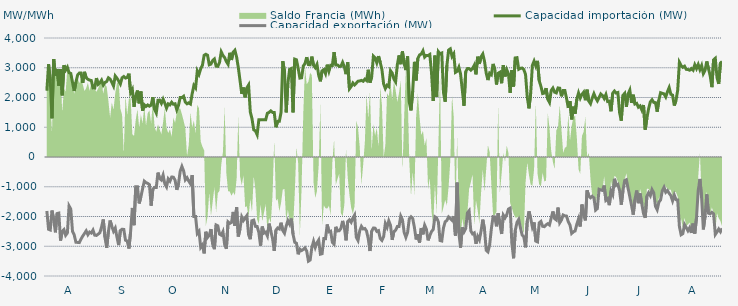
| Category | Capacidad importación (MW) | Capacidad exportación (MW) |
|---|---|---|
| 0 | 2229.167 | -1813.75 |
| 1900-01-01 | 3118.458 | -2430.875 |
| 1900-01-02 | 2560.5 | -2453.333 |
| 1900-01-03 | 1300 | -1800 |
| 1900-01-04 | 3293.208 | -2107.333 |
| 1900-01-05 | 2732.333 | -2531.667 |
| 1900-01-06 | 2958.208 | -1899.667 |
| 1900-01-07 | 2400 | -1885.417 |
| 1900-01-08 | 2949.792 | -2809.042 |
| 1900-01-09 | 2072.292 | -2500 |
| 1900-01-10 | 3083.958 | -2440.167 |
| 1900-01-11 | 2921.208 | -2632.667 |
| 1900-01-12 | 3017.667 | -2556.542 |
| 1900-01-13 | 2833.833 | -1646.083 |
| 1900-01-14 | 2807.833 | -1750 |
| 1900-01-15 | 2510.417 | -2496.792 |
| 1900-01-16 | 2220.833 | -2618.625 |
| 1900-01-17 | 2512.5 | -2867.042 |
| 1900-01-18 | 2756.375 | -2870.75 |
| 1900-01-19 | 2821.542 | -2876.667 |
| 1900-01-20 | 2821.833 | -2755.625 |
| 1900-01-21 | 2490.292 | -2656.833 |
| 1900-01-22 | 2862.667 | -2571.458 |
| 1900-01-23 | 2663.042 | -2482.25 |
| 1900-01-24 | 2613.625 | -2612.792 |
| 1900-01-25 | 2585.667 | -2523.458 |
| 1900-01-26 | 2571.292 | -2556.167 |
| 1900-01-27 | 2320.458 | -2456.542 |
| 1900-01-28 | 2316.542 | -2627.667 |
| 1900-01-29 | 2652.5 | -2635.708 |
| 1900-01-30 | 2442.625 | -2594.208 |
| 1900-01-31 | 2493.458 | -2546.125 |
| 1900-02-01 | 2582.917 | -2351.208 |
| 1900-02-02 | 2416.667 | -2100 |
| 1900-02-03 | 2504.5 | -2703.167 |
| 1900-02-04 | 2536.625 | -3052.25 |
| 1900-02-05 | 2662.208 | -2510.833 |
| 1900-02-06 | 2620.667 | -2134.75 |
| 1900-02-07 | 2511.833 | -2330.583 |
| 1900-02-08 | 2387.333 | -2494.25 |
| 1900-02-09 | 2724.583 | -2389 |
| 1900-02-10 | 2648.667 | -2691.542 |
| 1900-02-11 | 2557.292 | -2961.542 |
| 1900-02-12 | 2454.083 | -2472.25 |
| 1900-02-13 | 2661.417 | -2427.292 |
| 1900-02-14 | 2704.833 | -2434.167 |
| 1900-02-15 | 2653.75 | -2795.833 |
| 1900-02-16 | 2673.75 | -2822.875 |
| 1900-02-17 | 2800.917 | -3075.208 |
| 1900-02-18 | 2164.417 | -2510.625 |
| 1900-02-19 | 2270.833 | -1713.542 |
| 1900-02-20 | 1687.5 | -2291.667 |
| 1900-02-21 | 2066.667 | -1000 |
| 1900-02-22 | 2233.333 | -1000 |
| 1900-02-23 | 1804.167 | -1561.333 |
| 1900-02-24 | 2201.833 | -1341.667 |
| 1900-02-25 | 1556.25 | -1070.833 |
| 1900-02-26 | 1756.25 | -812.5 |
| 1900-02-27 | 1700 | -864.583 |
| 1900-02-28 | 1750 | -885.417 |
| 1900-02-28 | 1708.333 | -929.167 |
| 1900-03-01 | 1743.75 | -1636.25 |
| 1900-03-02 | 2008.083 | -1077.083 |
| 1900-03-03 | 1602.083 | -1020.833 |
| 1900-03-04 | 1479.167 | -1022.917 |
| 1900-03-05 | 1910.417 | -525 |
| 1900-03-06 | 1912.5 | -727.083 |
| 1900-03-07 | 1804.167 | -775 |
| 1900-03-08 | 1945.833 | -608.333 |
| 1900-03-09 | 1808.333 | -904.167 |
| 1900-03-10 | 1641.667 | -1006.25 |
| 1900-03-11 | 1785.417 | -735.417 |
| 1900-03-12 | 1752.083 | -812.5 |
| 1900-03-13 | 1841.667 | -675 |
| 1900-03-14 | 1772.917 | -677.083 |
| 1900-03-15 | 1788 | -777.083 |
| 1900-03-16 | 1587.5 | -1104.167 |
| 1900-03-17 | 1737.5 | -900 |
| 1900-03-18 | 1997.917 | -475 |
| 1900-03-19 | 1995.833 | -316.667 |
| 1900-03-20 | 2041.667 | -468.75 |
| 1900-03-21 | 1843.75 | -766.667 |
| 1900-03-22 | 1787.5 | -695.833 |
| 1900-03-23 | 1820.833 | -808.333 |
| 1900-03-24 | 1781.25 | -900 |
| 1900-03-25 | 2126.667 | -608.333 |
| 1900-03-26 | 2404.417 | -2000 |
| 1900-03-27 | 2323.167 | -2000 |
| 1900-03-28 | 2893.583 | -2571.5 |
| 1900-03-29 | 2778.083 | -2500.25 |
| 1900-03-30 | 2965.5 | -3038.667 |
| 1900-03-31 | 3083.64 | -2955.48 |
| 1900-04-01 | 3418.208 | -3238.958 |
| 1900-04-02 | 3452.875 | -2513.333 |
| 1900-04-03 | 3420.292 | -2703.208 |
| 1900-04-04 | 3100.083 | -2630.333 |
| 1900-04-05 | 3123.375 | -2422.458 |
| 1900-04-06 | 3242.792 | -2928.833 |
| 1900-04-07 | 3294.958 | -3098.417 |
| 1900-04-08 | 3054.042 | -2285.333 |
| 1900-04-09 | 3047.542 | -2315.25 |
| 1900-04-10 | 3179.458 | -2592.333 |
| 1900-04-11 | 3533.833 | -2627.792 |
| 1900-04-12 | 3414 | -2509.75 |
| 1900-04-13 | 3340.25 | -2944.208 |
| 1900-04-14 | 3208.208 | -3084.875 |
| 1900-04-15 | 3116.333 | -2180.292 |
| 1900-04-16 | 3502.875 | -2231.333 |
| 1900-04-17 | 3262.542 | -2201.667 |
| 1900-04-18 | 3524.167 | -1845.708 |
| 1900-04-19 | 3589.042 | -2314 |
| 1900-04-20 | 3358.375 | -1684.042 |
| 1900-04-21 | 3002 | -2672.375 |
| 1900-04-22 | 2567.583 | -2409.375 |
| 1900-04-23 | 2121 | -2013.417 |
| 1900-04-24 | 2334.5 | -2132.333 |
| 1900-04-25 | 2006.833 | -2047.042 |
| 1900-04-26 | 2325 | -1968.542 |
| 1900-04-27 | 2420.75 | -2611.292 |
| 1900-04-28 | 1517.25 | -2763 |
| 1900-04-29 | 1283.917 | -2141.667 |
| 1900-04-30 | 916.417 | -2120.833 |
| 1900-05-01 | 879.167 | -2332.417 |
| 1900-05-02 | 750 | -2334.958 |
| 1900-05-03 | 1250 | -2536 |
| 1900-05-04 | 1250 | -2982 |
| 1900-05-05 | 1250 | -2338.583 |
| 1900-05-06 | 1250 | -2558.333 |
| 1900-05-07 | 1250 | -2526.375 |
| 1900-05-08 | 1470.833 | -2652.25 |
| 1900-05-09 | 1500 | -2239.292 |
| 1900-05-10 | 1550 | -2486.75 |
| 1900-05-11 | 1500 | -2733.5 |
| 1900-05-12 | 1500 | -3155.125 |
| 1900-05-13 | 1000 | -2458.542 |
| 1900-05-14 | 1200 | -2385.25 |
| 1900-05-15 | 1200 | -2419 |
| 1900-05-16 | 1500 | -2208.75 |
| 1900-05-17 | 3221.708 | -2468.625 |
| 1900-05-18 | 2881.375 | -2561.25 |
| 1900-05-19 | 1500 | -2320.833 |
| 1900-05-20 | 2479.75 | -2136.875 |
| 1900-05-21 | 2947.875 | -2253.917 |
| 1900-05-22 | 2974.833 | -2068.75 |
| 1900-05-23 | 1500 | -2595.083 |
| 1900-05-24 | 3289.208 | -2867.583 |
| 1900-05-25 | 3267.875 | -2898.625 |
| 1900-05-26 | 2979.083 | -3270.083 |
| 1900-05-27 | 2652.375 | -3097.333 |
| 1900-05-28 | 2663.208 | -3144.542 |
| 1900-05-29 | 3058.292 | -3107.917 |
| 1900-05-30 | 3141.958 | -3054.292 |
| 1900-05-31 | 3354.667 | -3163.833 |
| 1900-06-01 | 3106.083 | -3500.875 |
| 1900-06-02 | 3099.042 | -3464.417 |
| 1900-06-03 | 3374.208 | -3046.25 |
| 1900-06-04 | 3081.083 | -2836.417 |
| 1900-06-05 | 3002 | -3040.417 |
| 1900-06-06 | 3113.875 | -2884.417 |
| 1900-06-07 | 2746.792 | -2789.333 |
| 1900-06-08 | 2544 | -3266.167 |
| 1900-06-09 | 2896.458 | -3250.667 |
| 1900-06-10 | 2937 | -2740.375 |
| 1900-06-11 | 2803.458 | -2745 |
| 1900-06-12 | 3104.125 | -2267.833 |
| 1900-06-13 | 2884.333 | -2514.583 |
| 1900-06-14 | 3081.042 | -2493.458 |
| 1900-06-15 | 3079.083 | -2866 |
| 1900-06-16 | 3524.292 | -2932.083 |
| 1900-06-17 | 3096.5 | -2347.083 |
| 1900-06-18 | 3096.5 | -2484.875 |
| 1900-06-19 | 3044.417 | -2478.583 |
| 1900-06-20 | 3048.167 | -2403.5 |
| 1900-06-21 | 3181.083 | -2147.542 |
| 1900-06-22 | 3030.708 | -2365.833 |
| 1900-06-23 | 2784.5 | -2801.333 |
| 1900-06-24 | 3182.417 | -2165.083 |
| 1900-06-25 | 2292.583 | -2110.5 |
| 1900-06-26 | 2370.25 | -2192.75 |
| 1900-06-27 | 2487.208 | -2051.417 |
| 1900-06-28 | 2421.292 | -1952.083 |
| 1900-06-29 | 2482.917 | -2699.375 |
| 1900-06-30 | 2548.458 | -2805.375 |
| 1900-07-01 | 2554.458 | -2484.042 |
| 1900-07-02 | 2574.083 | -2331.417 |
| 1900-07-03 | 2544.458 | -2417.833 |
| 1900-07-04 | 2615.833 | -2403.25 |
| 1900-07-05 | 2568.917 | -2488.625 |
| 1900-07-06 | 2932.208 | -2748.875 |
| 1900-07-07 | 2500.875 | -3160.125 |
| 1900-07-08 | 2689.458 | -2491.667 |
| 1900-07-09 | 3392.292 | -2386.5 |
| 1900-07-10 | 3335.083 | -2392.75 |
| 1900-07-11 | 3167.5 | -2500.5 |
| 1900-07-12 | 3390.625 | -2475.917 |
| 1900-07-13 | 3180.958 | -2741.75 |
| 1900-07-14 | 2936.5 | -2801.625 |
| 1900-07-15 | 2452.792 | -2674.667 |
| 1900-07-16 | 2300.208 | -2235.25 |
| 1900-07-17 | 2411.792 | -2365.167 |
| 1900-07-18 | 2366.75 | -2147.917 |
| 1900-07-19 | 2902.042 | -2292.875 |
| 1900-07-20 | 2822.25 | -2784.375 |
| 1900-07-21 | 2619.333 | -2505.792 |
| 1900-07-22 | 2523.292 | -2462.542 |
| 1900-07-23 | 3101.75 | -2337.5 |
| 1900-07-24 | 3414.042 | -2335.5 |
| 1900-07-25 | 3119.417 | -1987.458 |
| 1900-07-26 | 3547.333 | -2114.583 |
| 1900-07-27 | 3135.708 | -2530.042 |
| 1900-07-28 | 2921.125 | -2699.333 |
| 1900-07-29 | 3380.917 | -2535.75 |
| 1900-07-30 | 1842.042 | -2078.542 |
| 1900-07-31 | 1566.833 | -2010.417 |
| 1900-08-01 | 2214.542 | -2066.667 |
| 1900-08-02 | 3198.583 | -2370 |
| 1900-08-03 | 2574 | -2772.958 |
| 1900-08-04 | 3310.583 | -2592.083 |
| 1900-08-05 | 3430.75 | -2875.542 |
| 1900-08-06 | 3458.333 | -2387.75 |
| 1900-08-07 | 3568.125 | -2599.208 |
| 1900-08-08 | 3355.708 | -2294.333 |
| 1900-08-09 | 3414.333 | -2427 |
| 1900-08-10 | 3410.542 | -2802.125 |
| 1900-08-11 | 3447.375 | -2640.958 |
| 1900-08-12 | 2831.208 | -2506.667 |
| 1900-08-13 | 1881.583 | -2434.25 |
| 1900-08-14 | 3406.708 | -2011.583 |
| 1900-08-15 | 2022.5 | -2050 |
| 1900-08-16 | 3540.875 | -2176.417 |
| 1900-08-17 | 3466.542 | -2807.167 |
| 1900-08-18 | 3493.375 | -2823.167 |
| 1900-08-19 | 2166.833 | -2382.125 |
| 1900-08-20 | 1859.958 | -2177.167 |
| 1900-08-21 | 3077.875 | -2132.833 |
| 1900-08-22 | 3595.75 | -2015.417 |
| 1900-08-23 | 3634.375 | -2069.417 |
| 1900-08-24 | 3379.833 | -2125 |
| 1900-08-25 | 3470.304 | -1991.957 |
| 1900-08-26 | 2844 | -2641.708 |
| 1900-08-27 | 2880.625 | -862.5 |
| 1900-08-28 | 3017.208 | -2558.208 |
| 1900-08-29 | 2787.708 | -3047.042 |
| 1900-08-30 | 2256.625 | -2365.667 |
| 1900-08-31 | 1722.917 | -2515.917 |
| 1900-09-01 | 2869 | -2405.667 |
| 1900-09-02 | 2973.167 | -1879.167 |
| 1900-09-03 | 2971 | -1806.25 |
| 1900-09-04 | 2919.208 | -2484.833 |
| 1900-09-05 | 2973.125 | -2583.917 |
| 1900-09-06 | 3083.25 | -2551.375 |
| 1900-09-07 | 2777.875 | -2917.292 |
| 1900-09-08 | 3371.833 | -2672.292 |
| 1900-09-09 | 3131 | -2785.25 |
| 1900-09-10 | 3368.375 | -2480.958 |
| 1900-09-11 | 3462.292 | -2105.333 |
| 1900-09-12 | 3215.917 | -2442.958 |
| 1900-09-13 | 2817.875 | -3136.917 |
| 1900-09-14 | 2586 | -3188.792 |
| 1900-09-15 | 2815 | -2954.042 |
| 1900-09-16 | 2767 | -2418.75 |
| 1900-09-17 | 3129.208 | -2005 |
| 1900-09-18 | 2953.792 | -2013.417 |
| 1900-09-19 | 2437.083 | -2329.833 |
| 1900-09-20 | 2815.958 | -1889.333 |
| 1900-09-21 | 2849.708 | -2257.667 |
| 1900-09-22 | 2479.208 | -2586.833 |
| 1900-09-23 | 3084.333 | -1954.5 |
| 1900-09-24 | 2707.042 | -2046.583 |
| 1900-09-25 | 2933.542 | -1941.667 |
| 1900-09-26 | 2795.917 | -1750 |
| 1900-09-27 | 2158.042 | -1718.75 |
| 1900-09-28 | 2918.875 | -2898.083 |
| 1900-09-29 | 2368.375 | -3404.167 |
| 1900-09-30 | 3329.75 | -2465.083 |
| 1900-10-01 | 3339.208 | -2197.25 |
| 1900-10-02 | 2948.5 | -2100.583 |
| 1900-10-03 | 2980.792 | -2371.042 |
| 1900-10-04 | 2990.708 | -2620.708 |
| 1900-10-05 | 2938.333 | -2683 |
| 1900-10-06 | 2774.542 | -3036.75 |
| 1900-10-07 | 2014.917 | -2156.292 |
| 1900-10-08 | 1635.417 | -1825.292 |
| 1900-10-09 | 2140.25 | -2060.75 |
| 1900-10-10 | 3080.917 | -2353.125 |
| 1900-10-11 | 3223.333 | -2199.083 |
| 1900-10-12 | 3058.083 | -2827.667 |
| 1900-10-13 | 3231.167 | -2853.292 |
| 1900-10-14 | 2562 | -2213.625 |
| 1900-10-15 | 2375 | -2164.25 |
| 1900-10-16 | 2133.333 | -2329.5 |
| 1900-10-17 | 2150 | -2341.083 |
| 1900-10-18 | 2314.583 | -2282 |
| 1900-10-19 | 1943.75 | -2242.25 |
| 1900-10-20 | 1835.625 | -2285.208 |
| 1900-10-21 | 2235.417 | -2055.542 |
| 1900-10-22 | 2316.667 | -1831.25 |
| 1900-10-23 | 2178.125 | -2071.583 |
| 1900-10-24 | 2154.167 | -2116.125 |
| 1900-10-25 | 2321.417 | -1699.458 |
| 1900-10-26 | 2312 | -2210.167 |
| 1900-10-27 | 2040.917 | -2118.083 |
| 1900-10-28 | 2233.083 | -1949.458 |
| 1900-10-29 | 2234.854 | -1977.083 |
| 1900-10-30 | 1964.583 | -1985.792 |
| 1900-10-31 | 1650 | -2177.417 |
| 1900-11-01 | 1877.083 | -2287.667 |
| 1900-11-02 | 1264.583 | -2568.708 |
| 1900-11-03 | 1691.667 | -2512.667 |
| 1900-11-04 | 1456.25 | -2486.333 |
| 1900-11-05 | 1945.833 | -2259.083 |
| 1900-11-06 | 2154.167 | -2079.5 |
| 1900-11-07 | 1979.167 | -2336.083 |
| 1900-11-08 | 2104.167 | -1597.917 |
| 1900-11-09 | 2179.167 | -1954.167 |
| 1900-11-10 | 1908.333 | -2131.25 |
| 1900-11-11 | 2262.5 | -1118.75 |
| 1900-11-12 | 1879.167 | -1314.583 |
| 1900-11-13 | 1791.667 | -1368 |
| 1900-11-14 | 1977.083 | -1316.667 |
| 1900-11-15 | 2127.083 | -1377.083 |
| 1900-11-16 | 1987.5 | -1785.417 |
| 1900-11-17 | 1887.5 | -1733.333 |
| 1900-11-18 | 2002.083 | -1085.417 |
| 1900-11-19 | 2118.75 | -1110.417 |
| 1900-11-20 | 2066.667 | -1125 |
| 1900-11-21 | 1966.667 | -958.333 |
| 1900-11-22 | 2097.917 | -1454.167 |
| 1900-11-23 | 1864.583 | -1397.917 |
| 1900-11-24 | 1877.083 | -1618.75 |
| 1900-11-25 | 1537.5 | -1143.75 |
| 1900-11-26 | 2145.833 | -1264 |
| 1900-11-27 | 2216.667 | -731.25 |
| 1900-11-28 | 2150 | -950 |
| 1900-11-29 | 2167.583 | -916.667 |
| 1900-11-30 | 1493.75 | -1122.25 |
| 1900-12-01 | 1220.833 | -1604.167 |
| 1900-12-02 | 2072.917 | -1125 |
| 1900-12-03 | 2139.583 | -791.667 |
| 1900-12-04 | 1687.5 | -764.583 |
| 1900-12-05 | 2116.667 | -1058.333 |
| 1900-12-06 | 2247.917 | -1337.5 |
| 1900-12-07 | 1818.75 | -1627.083 |
| 1900-12-08 | 2093.75 | -1937.5 |
| 1900-12-09 | 1781.25 | -1422.917 |
| 1900-12-10 | 1804.167 | -1127.083 |
| 1900-12-11 | 1675 | -1552.083 |
| 1900-12-12 | 1716.667 | -1225 |
| 1900-12-13 | 1583.333 | -1570.833 |
| 1900-12-14 | 1747.917 | -1904.167 |
| 1900-12-15 | 918.75 | -2042.875 |
| 1900-12-16 | 1314.583 | -1310.417 |
| 1900-12-17 | 1629.167 | -1200 |
| 1900-12-18 | 1852.083 | -1300.583 |
| 1900-12-19 | 1925 | -1095.833 |
| 1900-12-20 | 1835.417 | -1208.333 |
| 1900-12-21 | 1827.083 | -1656.25 |
| 1900-12-22 | 1522.917 | -1770.917 |
| 1900-12-23 | 1916.667 | -1518.75 |
| 1900-12-24 | 2160.417 | -1441.667 |
| 1900-12-25 | 2139.583 | -1137.5 |
| 1900-12-26 | 2120.833 | -1018.75 |
| 1900-12-27 | 2018.75 | -1183.333 |
| 1900-12-28 | 2193.75 | -1127.083 |
| 1900-12-29 | 2333.333 | -1220.833 |
| 1900-12-30 | 2108.333 | -1295.833 |
| 1900-12-31 | 2079.833 | -1472.917 |
| 1901-01-01 | 1729.167 | -1281.25 |
| 1901-01-02 | 1897.917 | -1434.542 |
| 1901-01-03 | 2247 | -1443.75 |
| 1901-01-04 | 3185.083 | -2337 |
| 1901-01-05 | 3075.167 | -2613.625 |
| 1901-01-06 | 3013.625 | -2576.5 |
| 1901-01-07 | 3052.042 | -2269.25 |
| 1901-01-08 | 2946.333 | -2370.833 |
| 1901-01-09 | 2940.542 | -2478.958 |
| 1901-01-10 | 2917.208 | -2375.625 |
| 1901-01-11 | 2971.167 | -2551.875 |
| 1901-01-12 | 2917.292 | -2238 |
| 1901-01-13 | 3101.958 | -2573.167 |
| 1901-01-14 | 2973.375 | -2041.667 |
| 1901-01-15 | 3109.875 | -1120.167 |
| 1901-01-16 | 2936.333 | -737.5 |
| 1901-01-17 | 3074.833 | -1371.667 |
| 1901-01-18 | 2802.417 | -2434.917 |
| 1901-01-19 | 2913.625 | -1996.875 |
| 1901-01-20 | 3212.125 | -1254.167 |
| 1901-01-21 | 2973 | -1887.5 |
| 1901-01-22 | 2732 | -1910.417 |
| 1901-01-23 | 2348.333 | -1858 |
| 1901-01-24 | 3266 | -1911.25 |
| 1901-01-25 | 3318.417 | -2603.917 |
| 1901-01-26 | 2666.292 | -2519.292 |
| 1901-01-27 | 2457.667 | -2420.375 |
| 1901-01-28 | 3159.917 | -2510.583 |
| 1901-01-29 | 3208.208 | -2395.833 |